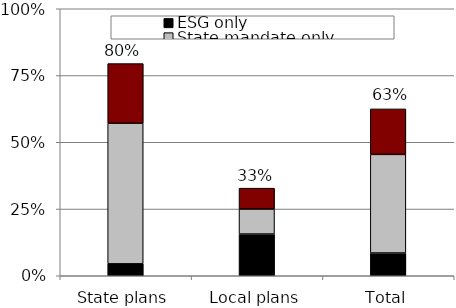
| Category | ESG only | State mandate only | Both |
|---|---|---|---|
| State plans | 0.045 | 0.527 | 0.223 |
| Local plans | 0.156 | 0.094 | 0.078 |
| Total | 0.085 | 0.369 | 0.17 |